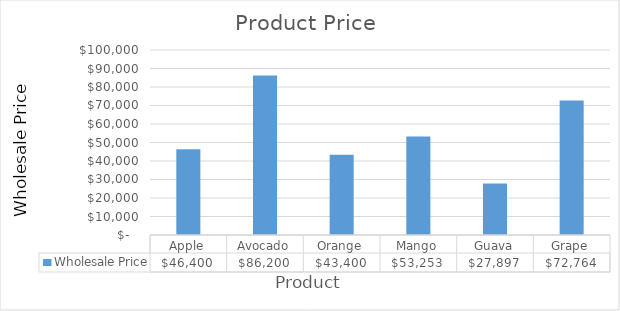
| Category | Wholesale Price |
|---|---|
| Apple | 46400 |
| Avocado | 86200 |
| Orange | 43400 |
| Mango | 53253 |
| Guava | 27897 |
| Grape | 72764 |